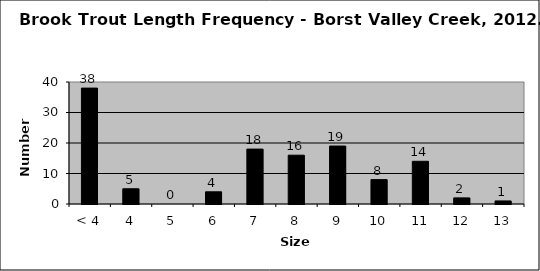
| Category | Series 0 |
|---|---|
| < 4 | 38 |
| 4 | 5 |
| 5 | 0 |
| 6 | 4 |
| 7 | 18 |
| 8 | 16 |
| 9 | 19 |
| 10 | 8 |
| 11 | 14 |
| 12 | 2 |
| 13 | 1 |